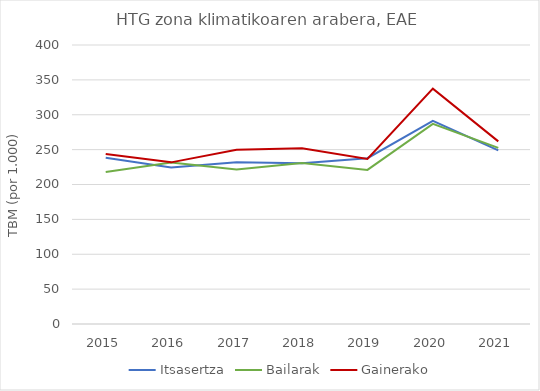
| Category | Itsasertza | Bailarak | Gainerako |
|---|---|---|---|
| 2015.0 | 238.391 | 217.87 | 243.721 |
| 2016.0 | 224.21 | 231.564 | 231.74 |
| 2017.0 | 231.932 | 221.363 | 249.894 |
| 2018.0 | 230.489 | 230.867 | 251.943 |
| 2019.0 | 237.645 | 220.873 | 236.749 |
| 2020.0 | 291.223 | 287 | 337.449 |
| 2021.0 | 248.858 | 252.506 | 261.849 |